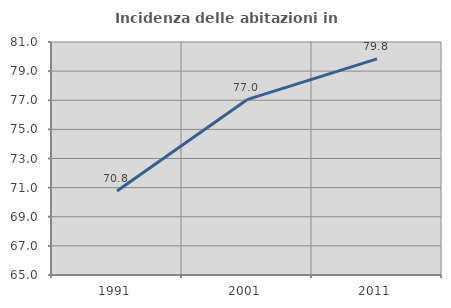
| Category | Incidenza delle abitazioni in proprietà  |
|---|---|
| 1991.0 | 70.766 |
| 2001.0 | 77.041 |
| 2011.0 | 79.842 |